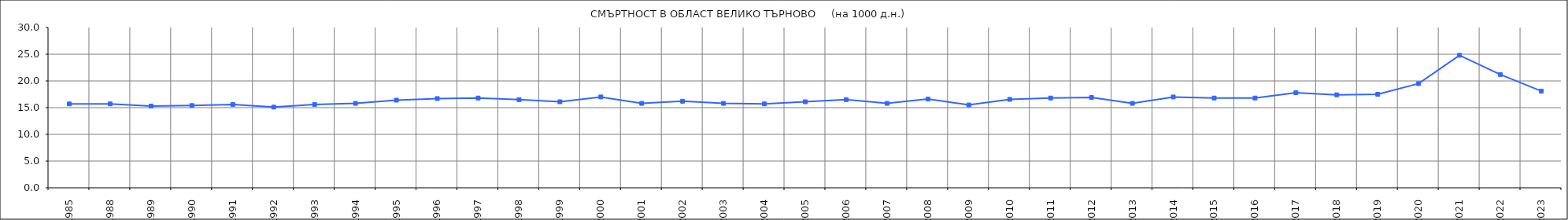
| Category | Series 0 | Series 1 |
|---|---|---|
| 1985.0 | 15.7 |  |
| 1988.0 | 15.7 |  |
| 1989.0 | 15.3 |  |
| 1990.0 | 15.4 |  |
| 1991.0 | 15.6 |  |
| 1992.0 | 15.1 |  |
| 1993.0 | 15.6 |  |
| 1994.0 | 15.8 |  |
| 1995.0 | 16.4 |  |
| 1996.0 | 16.7 |  |
| 1997.0 | 16.8 |  |
| 1998.0 | 16.5 |  |
| 1999.0 | 16.1 |  |
| 2000.0 | 17 |  |
| 2001.0 | 15.8 |  |
| 2002.0 | 16.2 |  |
| 2003.0 | 15.8 |  |
| 2004.0 | 15.7 |  |
| 2005.0 | 16.1 |  |
| 2006.0 | 16.5 |  |
| 2007.0 | 15.8 |  |
| 2008.0 | 16.6 |  |
| 2009.0 | 15.5 |  |
| 2010.0 | 16.55 |  |
| 2011.0 | 16.8 |  |
| 2012.0 | 16.9 |  |
| 2013.0 | 15.8 |  |
| 2014.0 | 17 |  |
| 2015.0 | 16.8 |  |
| 2016.0 | 16.8 |  |
| 2017.0 | 17.8 |  |
| 2018.0 | 17.4 |  |
| 2019.0 | 17.5 |  |
| 2020.0 | 19.5 |  |
| 2021.0 | 24.8 |  |
| 2022.0 | 21.2 |  |
| 2023.0 | 18.1 |  |